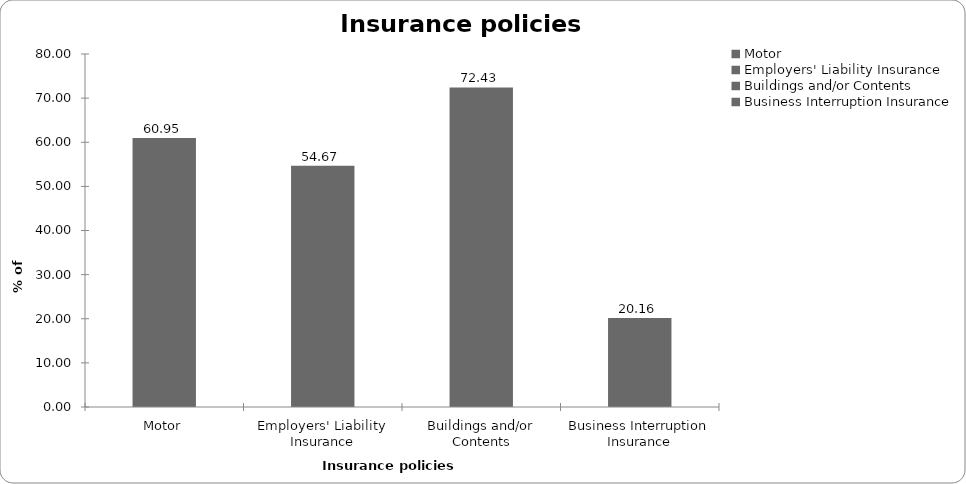
| Category | Series 0 |
|---|---|
| Motor | 60.948 |
| Employers' Liability Insurance | 54.673 |
| Buildings and/or Contents | 72.43 |
| Business Interruption Insurance | 20.16 |